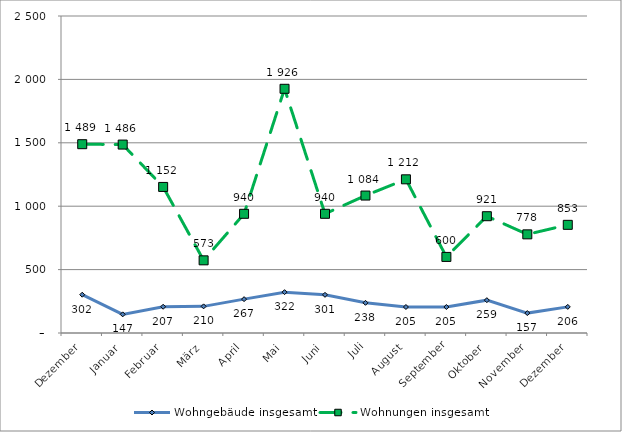
| Category | Wohngebäude insgesamt | Wohnungen insgesamt |
|---|---|---|
| Dezember | 302 | 1489 |
| Januar | 147 | 1486 |
| Februar | 207 | 1152 |
| März | 210 | 573 |
| April | 267 | 940 |
| Mai | 322 | 1926 |
| Juni | 301 | 940 |
| Juli | 238 | 1084 |
| August | 205 | 1212 |
| September | 205 | 600 |
| Oktober | 259 | 921 |
| November | 157 | 778 |
| Dezember | 206 | 853 |